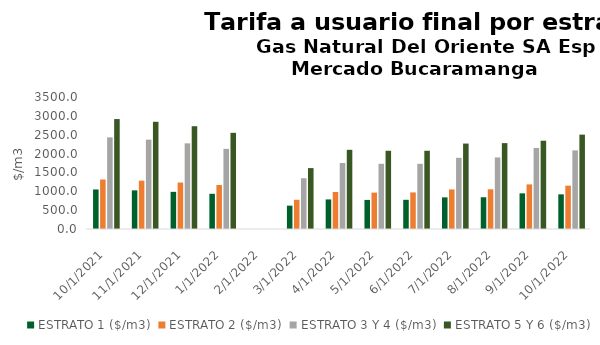
| Category | ESTRATO 1 ($/m3) | ESTRATO 2 ($/m3) | ESTRATO 3 Y 4 ($/m3) | ESTRATO 5 Y 6 ($/m3) |
|---|---|---|---|---|
| 10/1/21 | 1048.69 | 1312.09 | 2429.15 | 2914.98 |
| 11/1/21 | 1024.52 | 1281.8 | 2369.02 | 2842.824 |
| 12/1/21 | 984.71 | 1232.46 | 2271.12 | 2725.344 |
| 1/1/22 | 933.31 | 1167.13 | 2124.99 | 2549.988 |
| 3/1/22 | 619.21 | 774.52 | 1345.69 | 1614.828 |
| 4/1/22 | 784.02 | 980.83 | 1750.02 | 2100.024 |
| 5/1/22 | 771.14 | 964.71 | 1728.64 | 2074.368 |
| 6/1/22 | 774.53 | 969.94 | 1728.64 | 2074.368 |
| 7/1/22 | 839.04 | 1049.2 | 1887.96 | 2265.552 |
| 8/1/22 | 841.95 | 1052.81 | 1897.33 | 2276.796 |
| 9/1/22 | 945.64 | 1182.71 | 2149.77 | 2341.1 |
| 10/1/22 | 918.84 | 1148.91 | 2085 | 2502 |